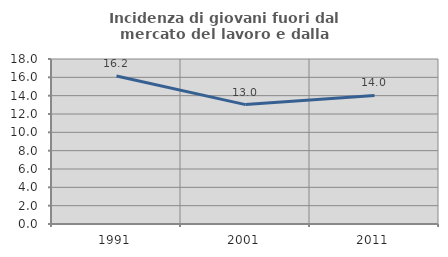
| Category | Incidenza di giovani fuori dal mercato del lavoro e dalla formazione  |
|---|---|
| 1991.0 | 16.152 |
| 2001.0 | 13.024 |
| 2011.0 | 14.021 |